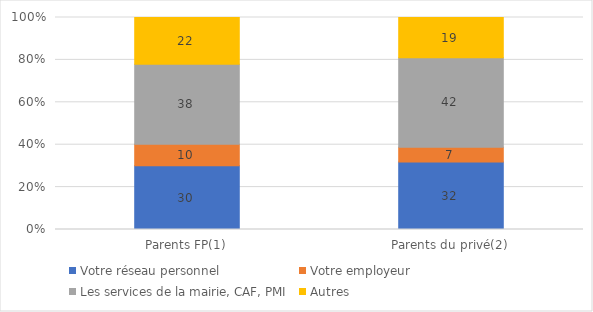
| Category | Votre réseau personnel  | Votre employeur | Les services de la mairie, CAF, PMI | Autres |
|---|---|---|---|---|
| Parents FP(1) | 30 | 10.17 | 37.64 | 22 |
| Parents du privé(2) | 32 | 7 | 42.38 | 19 |